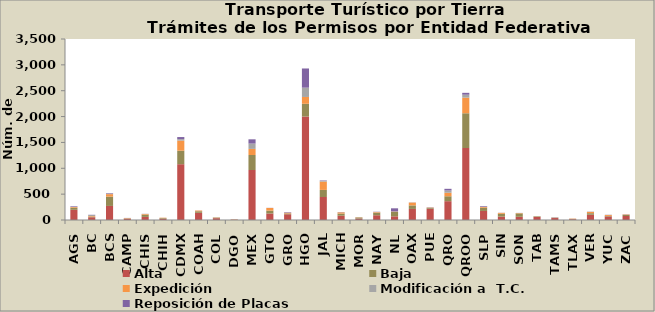
| Category | Alta                                         | Baja | Expedición | Modificación a  T.C. | Reposición de Placas | Otros |
|---|---|---|---|---|---|---|
| AGS | 197 | 42 | 12 | 2 | 12 |  |
| BC | 53 | 7 | 14 | 23 | 4 |  |
| BCS | 272 | 180 | 48 | 12 | 9 |  |
| CAMP | 24 | 6 | 7 | 0 | 3 |  |
| CHIS | 60 | 42 | 13 | 4 | 1 |  |
| CHIH | 25 | 12 | 7 | 1 | 0 |  |
| CDMX | 1079 | 261 | 196 | 28 | 40 |  |
| COAH | 139 | 30 | 14 | 0 | 1 |  |
| COL | 35 | 11 | 4 | 0 | 1 |  |
| DGO | 7 | 2 | 4 | 0 | 0 |  |
| MEX | 967 | 290 | 118 | 103 | 82 |  |
| GTO | 126 | 55 | 52 | 0 | 2 |  |
| GRO | 111 | 16 | 13 | 0 | 10 |  |
| HGO | 2001 | 246 | 132 | 180 | 371 |  |
| JAL | 445 | 137 | 161 | 15 | 8 |  |
| MICH | 83 | 41 | 24 | 1 | 4 |  |
| MOR | 28 | 21 | 4 | 0 | 1 |  |
| NAY | 92 | 48 | 12 | 4 | 4 |  |
| NL | 71 | 88 | 5 | 2 | 60 |  |
| OAX | 214 | 68 | 55 | 3 | 1 |  |
| PUE | 218 | 17 | 6 | 1 | 4 |  |
| QRO | 364 | 95 | 68 | 44 | 32 |  |
| QROO | 1392 | 672 | 302 | 57 | 36 |  |
| SLP | 175 | 63 | 15 | 5 | 12 |  |
| SIN | 66 | 54 | 18 | 0 | 2 |  |
| SON | 62 | 66 | 7 | 0 | 2 |  |
| TAB | 58 | 11 | 3 | 4 | 0 |  |
| TAMS | 38 | 7 | 2 | 0 | 4 |  |
| TLAX | 15 | 6 | 6 | 0 | 1 |  |
| VER | 102 | 30 | 24 | 4 | 2 |  |
| YUC | 69 | 10 | 18 | 3 | 2 |  |
| ZAC | 77 | 20 | 9 | 2 | 3 |  |